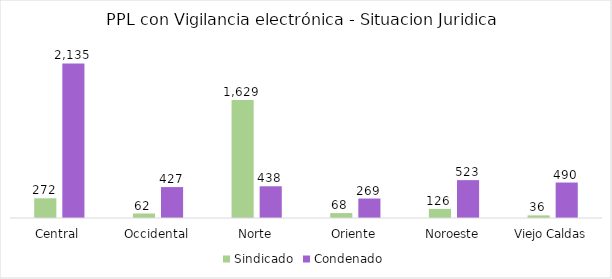
| Category | Sindicado | Condenado |
|---|---|---|
| Central | 272 | 2135 |
| Occidental | 62 | 427 |
| Norte | 1629 | 438 |
| Oriente | 68 | 269 |
| Noroeste | 126 | 523 |
| Viejo Caldas | 36 | 490 |